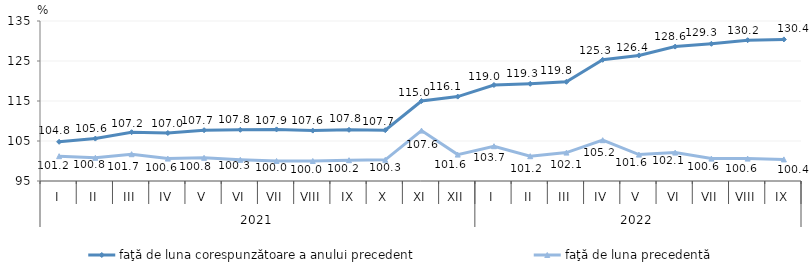
| Category | faţă de luna corespunzătoare a anului precedent | faţă de luna precedentă   |
|---|---|---|
| 0 | 104.8 | 101.2 |
| 1 | 105.6 | 100.8 |
| 2 | 107.2 | 101.7 |
| 3 | 107 | 100.6 |
| 4 | 107.7 | 100.8 |
| 5 | 107.8 | 100.3 |
| 6 | 107.9 | 100 |
| 7 | 107.6 | 100 |
| 8 | 107.8 | 100.2 |
| 9 | 107.7 | 100.3 |
| 10 | 115 | 107.6 |
| 11 | 116.1 | 101.6 |
| 12 | 119 | 103.7 |
| 13 | 119.3 | 101.2 |
| 14 | 119.8 | 102.1 |
| 15 | 125.3 | 105.2 |
| 16 | 126.4 | 101.6 |
| 17 | 128.6 | 102.1 |
| 18 | 129.3 | 100.6 |
| 19 | 130.2 | 100.6 |
| 20 | 130.4 | 100.4 |